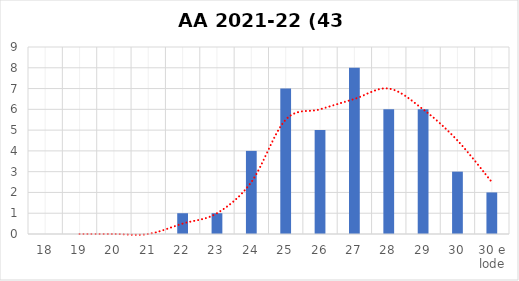
| Category | Series 0 |
|---|---|
| 18 | 0 |
| 19 | 0 |
| 20 | 0 |
| 21 | 0 |
| 22 | 1 |
| 23 | 1 |
| 24 | 4 |
| 25 | 7 |
| 26 | 5 |
| 27 | 8 |
| 28 | 6 |
| 29 | 6 |
| 30 | 3 |
| 30 e lode | 2 |